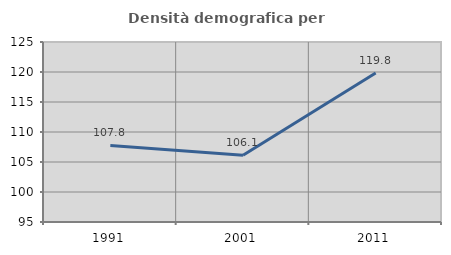
| Category | Densità demografica |
|---|---|
| 1991.0 | 107.763 |
| 2001.0 | 106.131 |
| 2011.0 | 119.836 |